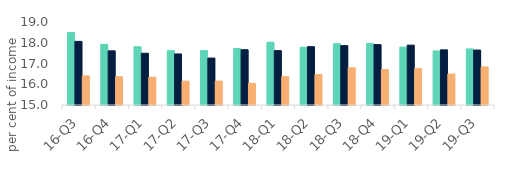
| Category | First-time
buyers | Homemovers | Homowner remortgaging |
|---|---|---|---|
| 16-Q3 | 18.488 | 18.067 | 16.403 |
| 16-Q4 | 17.925 | 17.609 | 16.362 |
| 17-Q1 | 17.806 | 17.495 | 16.341 |
| 17-Q2 | 17.618 | 17.46 | 16.15 |
| 17-Q3 | 17.62 | 17.262 | 16.154 |
| 17-Q4 | 17.724 | 17.664 | 16.044 |
| 18-Q1 | 18.025 | 17.62 | 16.364 |
| 18-Q2 | 17.783 | 17.812 | 16.471 |
| 18-Q3 | 17.952 | 17.861 | 16.791 |
| 18-Q4 | 17.969 | 17.91 | 16.708 |
| 19-Q1 | 17.791 | 17.885 | 16.752 |
| 19-Q2 | 17.606 | 17.658 | 16.491 |
| 19-Q3 | 17.702 | 17.648 | 16.837 |